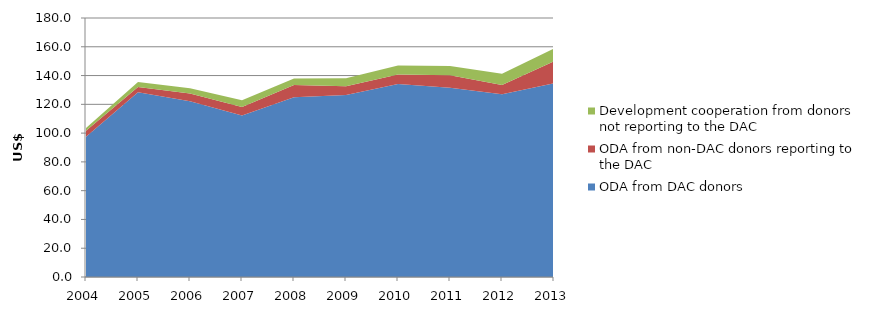
| Category | ODA from DAC donors | ODA from non-DAC donors reporting to the DAC  | Development cooperation from donors not reporting to the DAC |
|---|---|---|---|
| 2004 | 97.519 | 4.122 | 1.912 |
| 2005 | 128.411 | 3.714 | 3.32 |
| 2006 | 122.092 | 5.373 | 3.714 |
| 2007 | 112.205 | 6 | 4.585 |
| 2008 | 124.873 | 8.515 | 4.607 |
| 2009 | 126.429 | 6.191 | 5.503 |
| 2010 | 134.046 | 6.774 | 6.145 |
| 2011 | 131.454 | 8.758 | 6.471 |
| 2012 | 126.949 | 6.488 | 7.853 |
| 2013 | 134.698 | 15.274 | 8.764 |